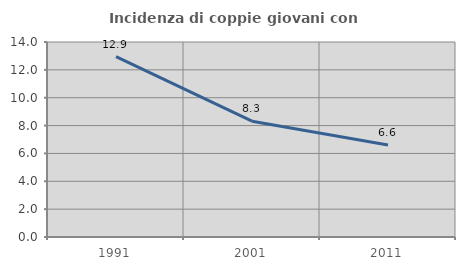
| Category | Incidenza di coppie giovani con figli |
|---|---|
| 1991.0 | 12.942 |
| 2001.0 | 8.314 |
| 2011.0 | 6.609 |